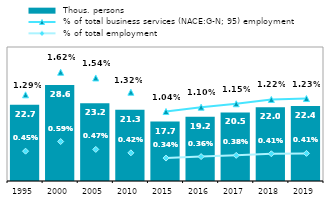
| Category |  Thous. persons |
|---|---|
| 1995.0 | 22.729 |
| 2000.0 | 28.622 |
| 2005.0 | 23.2 |
| 2010.0 | 21.261 |
| 2015.0 | 17.733 |
| 2016.0 | 19.175 |
| 2017.0 | 20.459 |
| 2018.0 | 22.009 |
| 2019.0 | 22.383 |